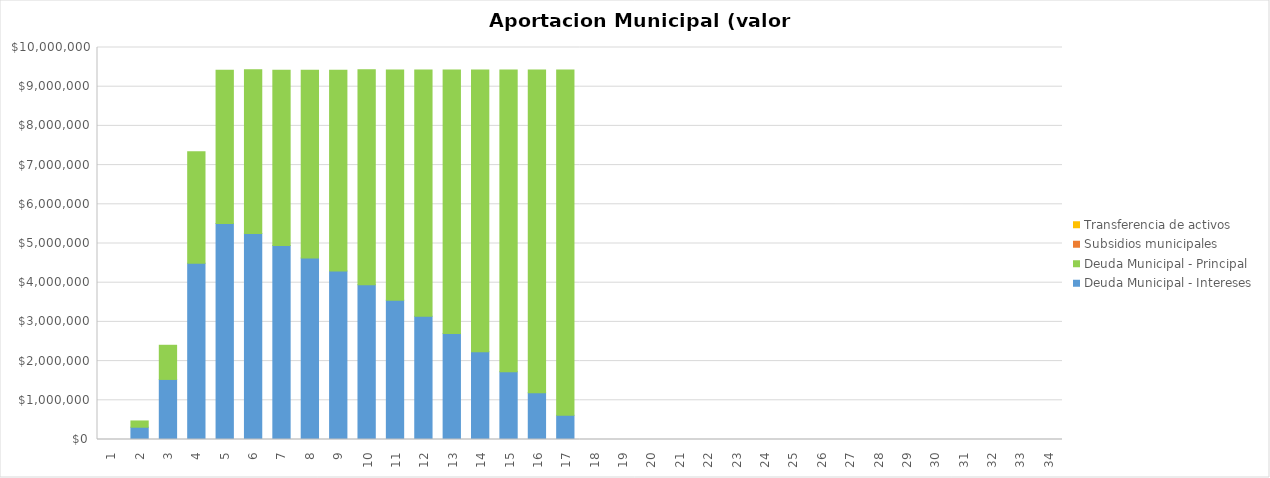
| Category | Deuda Municipal - Intereses | Deuda Municipal - Principal | Subsidios municipales | Transferencia de activos |
|---|---|---|---|---|
| 0 | 0 | 0 | 0 | 0 |
| 1 | 313332.494 | 159787.501 | 0 | 0 |
| 2 | 1532437.41 | 871182.452 | 0 | 0 |
| 3 | 4494527.953 | 2847279.517 | 0 | 0 |
| 4 | 5512064.883 | 3909695.663 | 0 | 0 |
| 5 | 5253230.29 | 4178492.959 | 0 | 0 |
| 6 | 4945891.679 | 4476519.835 | 0 | 0 |
| 7 | 4632535.291 | 4789876.224 | 0 | 0 |
| 8 | 4297243.955 | 5125167.559 | 0 | 0 |
| 9 | 3949642.769 | 5480013.025 | 0 | 0 |
| 10 | 3554881.314 | 5868256.876 | 0 | 0 |
| 11 | 3144103.333 | 6279034.857 | 0 | 0 |
| 12 | 2704570.893 | 6718567.297 | 0 | 0 |
| 13 | 2240602.474 | 7186755.751 | 0 | 0 |
| 14 | 1731198.28 | 7692744.408 | 0 | 0 |
| 15 | 1192706.171 | 8231236.517 | 0 | 0 |
| 16 | 616519.615 | 8807423.073 | 0 | 0 |
| 17 | 0 | 0 | 0 | 0 |
| 18 | 0 | 0 | 0 | 0 |
| 19 | 0 | 0 | 0 | 0 |
| 20 | 0 | 0 | 0 | 0 |
| 21 | 0 | 0 | 0 | 0 |
| 22 | 0 | 0 | 0 | 0 |
| 23 | 0 | 0 | 0 | 0 |
| 24 | 0 | 0 | 0 | 0 |
| 25 | 0 | 0 | 0 | 0 |
| 26 | 0 | 0 | 0 | 0 |
| 27 | 0 | 0 | 0 | 0 |
| 28 | 0 | 0 | 0 | 0 |
| 29 | 0 | 0 | 0 | 0 |
| 30 | 0 | 0 | 0 | 0 |
| 31 | 0 | 0 | 0 | 0 |
| 32 | 0 | 0 | 0 | 0 |
| 33 | 0 | 0 | 0 | 0 |